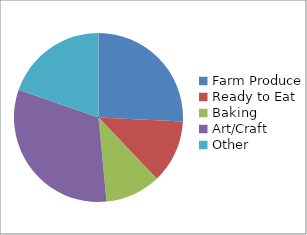
| Category | Series 0 |
|---|---|
| Farm Produce | 17 |
| Ready to Eat | 8 |
| Baking | 7 |
| Art/Craft | 21 |
| Other | 13 |